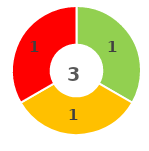
| Category | Series 0 |
|---|---|
| 0 | 0 |
| 1 | 1 |
| 2 | 1 |
| 3 | 1 |
| 4 | 0 |